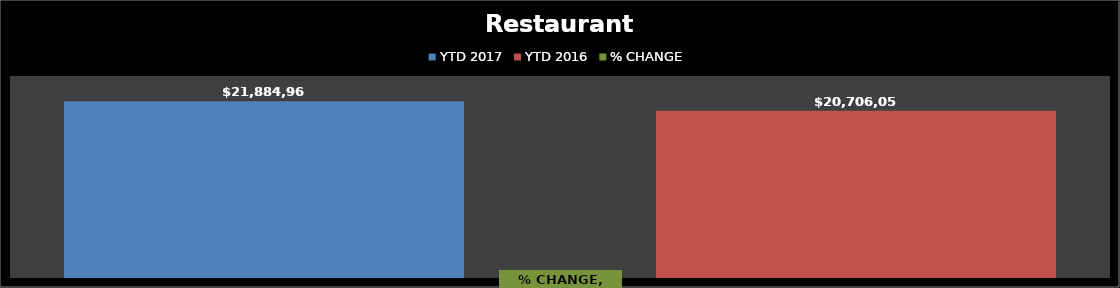
| Category | YTD 2017 | YTD 2016 |
|---|---|---|
| Restaurant Tax Distribution - 2017 | 21884968.03 | 20706056.281 |